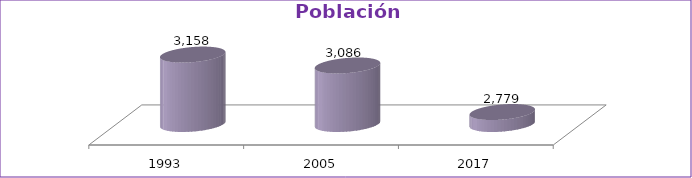
| Category | Población Total |
|---|---|
| 1993 | 3158 |
| 2005 | 3086 |
| 2017 | 2779 |